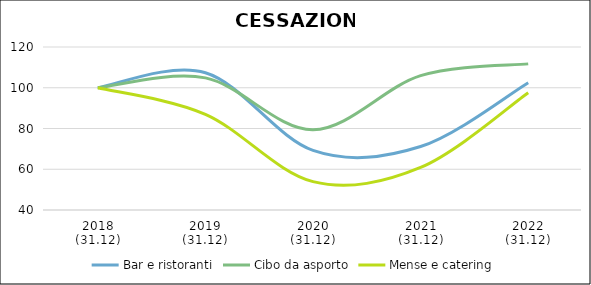
| Category | Bar e ristoranti | Cibo da asporto | Mense e catering |
|---|---|---|---|
| 2018
(31.12) | 100 | 100 | 100 |
| 2019
(31.12) | 107.349 | 104.844 | 86.94 |
| 2020
(31.12) | 69.232 | 79.375 | 53.928 |
| 2021
(31.12) | 71.141 | 105.938 | 60.916 |
| 2022
(31.12) | 102.479 | 111.719 | 97.542 |